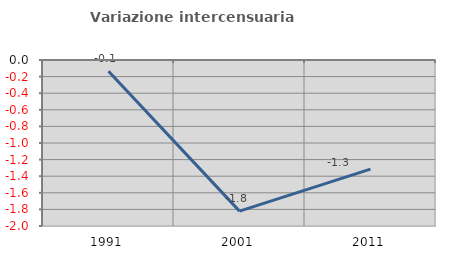
| Category | Variazione intercensuaria annua |
|---|---|
| 1991.0 | -0.136 |
| 2001.0 | -1.821 |
| 2011.0 | -1.314 |